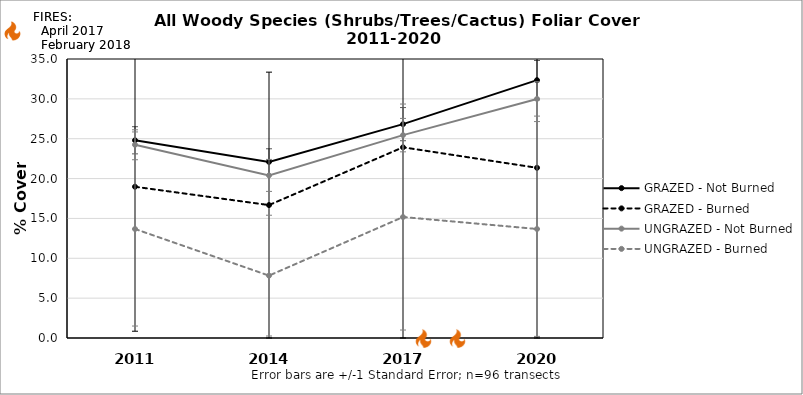
| Category | GRAZED - Not Burned | GRAZED - Burned | UNGRAZED - Not Burned | UNGRAZED - Burned |
|---|---|---|---|---|
| 2011.0 | 24.804 | 18.975 | 24.24 | 13.675 |
| 2014.0 | 22.092 | 16.675 | 20.396 | 7.825 |
| 2017.0 | 26.826 | 23.925 | 25.45 | 15.175 |
| 2020.0 | 32.345 | 21.35 | 29.993 | 13.675 |